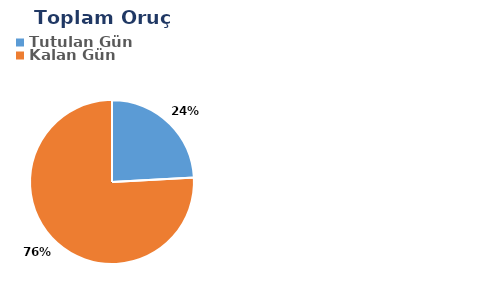
| Category | Toplam |
|---|---|
| Tutulan Gün | 7 |
| Kalan Gün | 22 |